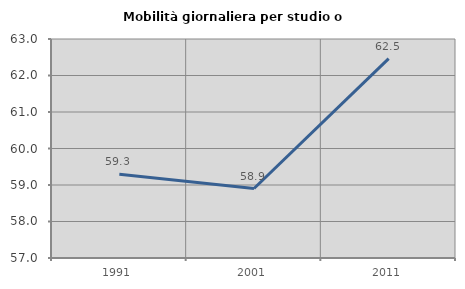
| Category | Mobilità giornaliera per studio o lavoro |
|---|---|
| 1991.0 | 59.298 |
| 2001.0 | 58.903 |
| 2011.0 | 62.462 |